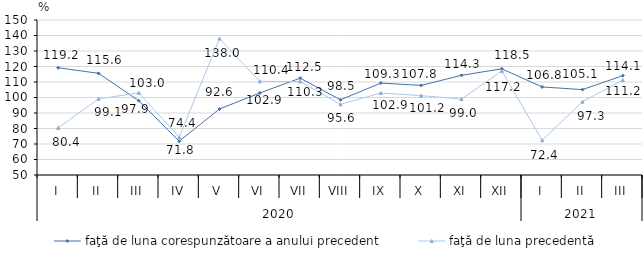
| Category | faţă de luna corespunzătoare a anului precedent | faţă de luna precedentă   |
|---|---|---|
| 0 | 119.2 | 80.4 |
| 1 | 115.6 | 99.1 |
| 2 | 97.9 | 103 |
| 3 | 71.8 | 74.4 |
| 4 | 92.6 | 138 |
| 5 | 102.9 | 110.4 |
| 6 | 112.5 | 110.3 |
| 7 | 98.5 | 95.6 |
| 8 | 109.3 | 102.9 |
| 9 | 107.8 | 101.2 |
| 10 | 114.3 | 99 |
| 11 | 118.5 | 117.2 |
| 12 | 106.8 | 72.4 |
| 13 | 105.1 | 97.3 |
| 14 | 114.1 | 111.2 |